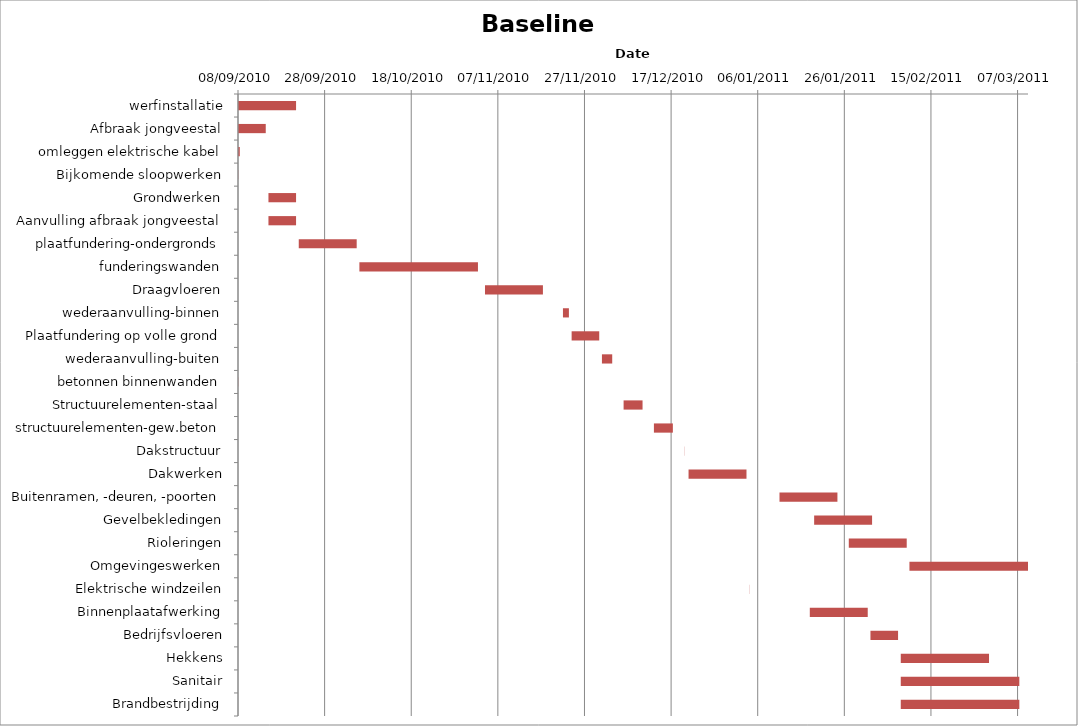
| Category | Baseline start | Actual duration |
|---|---|---|
| werfinstallatie | 40429.333 | 13.375 |
| Afbraak jongveestal | 40429.333 | 6.375 |
| omleggen elektrische kabel | 40429.333 | 0.375 |
| Bijkomende sloopwerken | 40429.333 | 0.042 |
| Grondwerken | 40436.333 | 6.375 |
| Aanvulling afbraak jongveestal | 40436.333 | 6.375 |
| plaatfundering-ondergronds | 40443.333 | 13.375 |
| funderingswanden | 40457.333 | 27.375 |
| Draagvloeren | 40486.333 | 13.375 |
| wederaanvulling-binnen | 40504.333 | 1.375 |
| Plaatfundering op volle grond | 40506.333 | 6.375 |
| wederaanvulling-buiten | 40513.333 | 2.375 |
| betonnen binnenwanden | 40429.333 | 0.042 |
| Structuurelementen-staal | 40518.333 | 4.375 |
| structuurelementen-gew.beton | 40525.333 | 4.375 |
| Dakstructuur | 40532.333 | 0.042 |
| Dakwerken | 40533.333 | 13.375 |
| Buitenramen, -deuren, -poorten | 40554.333 | 13.375 |
| Gevelbekledingen | 40562.333 | 13.375 |
| Rioleringen | 40570.333 | 13.375 |
| Omgevingeswerken | 40584.333 | 27.375 |
| Elektrische windzeilen | 40547.333 | 0.042 |
| Binnenplaatafwerking | 40561.333 | 13.375 |
| Bedrijfsvloeren | 40575.333 | 6.375 |
| Hekkens | 40582.333 | 20.375 |
| Sanitair | 40582.333 | 27.375 |
| Brandbestrijding | 40582.333 | 27.375 |